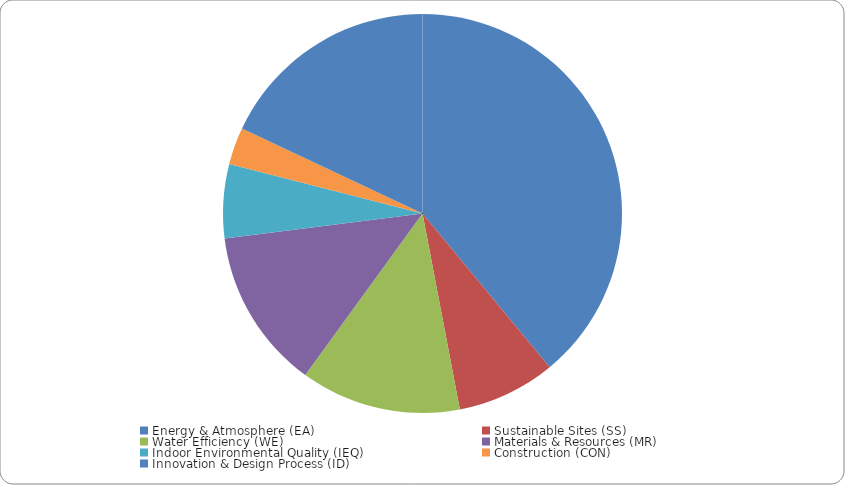
| Category | Series 0 |
|---|---|
| Energy & Atmosphere (EA)  | 0.39 |
| Sustainable Sites (SS)  | 0.08 |
| Water Efficiency (WE)  | 0.13 |
| Materials & Resources (MR)  | 0.13 |
| Indoor Environmental Quality (IEQ)  | 0.06 |
| Construction (CON)  | 0.03 |
| Innovation & Design Process (ID)  | 0.18 |